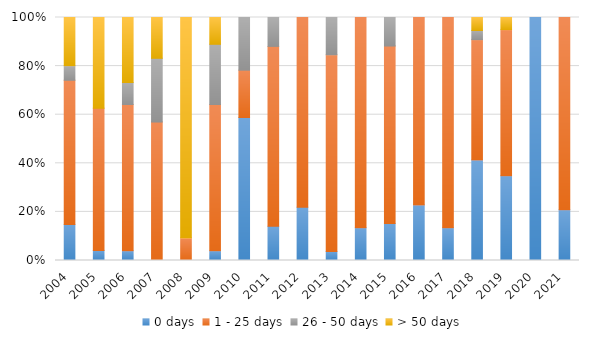
| Category | 0 days | 1 - 25 days | 26 - 50 days | > 50 days |
|---|---|---|---|---|
| 2004.0 | 14.778 | 59.389 | 6.005 | 19.828 |
| 2005.0 | 4.151 | 58.522 | 0 | 37.327 |
| 2006.0 | 3.983 | 60.202 | 9.052 | 26.763 |
| 2007.0 | 0 | 56.983 | 26.226 | 16.79 |
| 2008.0 | 0 | 4.151 | 0 | 40.611 |
| 2009.0 | 3.983 | 60.202 | 24.787 | 11.029 |
| 2010.0 | 58.837 | 19.478 | 21.685 | 0 |
| 2011.0 | 14.046 | 74.069 | 11.885 | 0 |
| 2012.0 | 21.902 | 78.098 | 0 | 0 |
| 2013.0 | 3.711 | 80.94 | 15.349 | 0 |
| 2014.0 | 13.525 | 86.475 | 0 | 0 |
| 2015.0 | 15.185 | 73.071 | 11.744 | 0 |
| 2016.0 | 22.874 | 77.126 | 0 | 0 |
| 2017.0 | 13.44 | 86.56 | 0 | 0 |
| 2018.0 | 41.369 | 49.507 | 3.784 | 5.34 |
| 2019.0 | 34.852 | 60.141 | 0 | 5.006 |
| 2020.0 | 100 | 0 | 0 | 0 |
| 2021.0 | 20.908 | 79.092 | 0 | 0 |